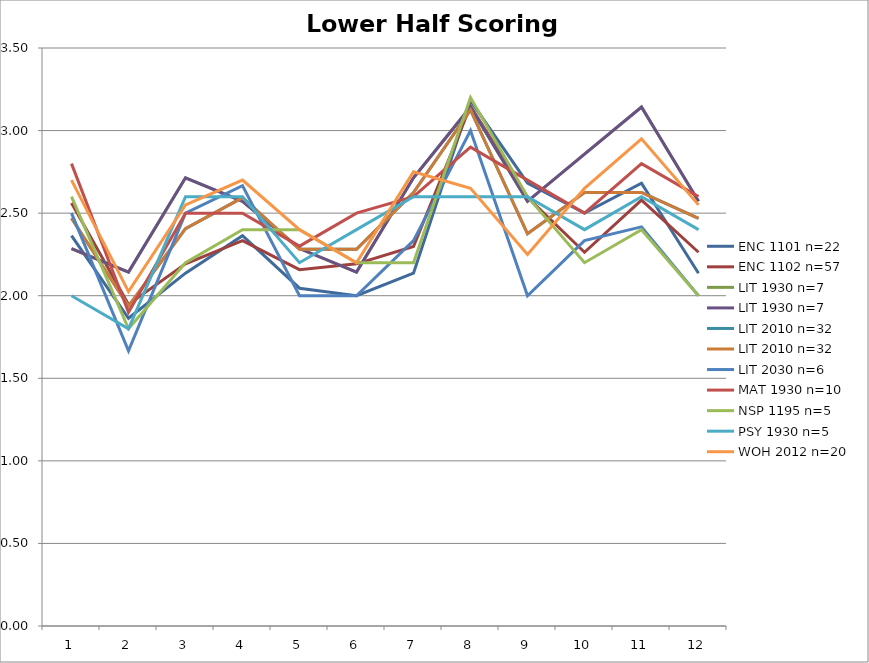
| Category | ENC 1101 n=22 | ENC 1102 n=57 | LIT 1930 n=7 | LIT 2010 n=32 | LIT 2030 n=6 | MAT 1930 n=10 | NSP 1195 n=5 | PSY 1930 n=5 | WOH 2012 n=20 |
|---|---|---|---|---|---|---|---|---|---|
| 0 | 2.364 | 2.561 | 2.286 | 2.469 | 2.5 | 2.8 | 2.6 | 2 | 2.7 |
| 1 | 1.864 | 1.947 | 2.143 | 1.938 | 1.667 | 1.9 | 1.8 | 1.8 | 2.025 |
| 2 | 2.136 | 2.193 | 2.714 | 2.406 | 2.5 | 2.5 | 2.2 | 2.6 | 2.55 |
| 3 | 2.364 | 2.333 | 2.571 | 2.594 | 2.667 | 2.5 | 2.4 | 2.6 | 2.7 |
| 4 | 2.045 | 2.158 | 2.286 | 2.281 | 2 | 2.3 | 2.4 | 2.2 | 2.4 |
| 5 | 2 | 2.193 | 2.143 | 2.281 | 2 | 2.5 | 2.2 | 2.4 | 2.2 |
| 6 | 2.136 | 2.298 | 2.714 | 2.625 | 2.333 | 2.6 | 2.2 | 2.6 | 2.75 |
| 7 | 3.182 | 3.149 | 3.143 | 3.125 | 3 | 2.9 | 3.2 | 2.6 | 2.65 |
| 8 | 2.682 | 2.596 | 2.571 | 2.375 | 2 | 2.7 | 2.6 | 2.6 | 2.25 |
| 9 | 2.5 | 2.263 | 2.857 | 2.625 | 2.333 | 2.5 | 2.2 | 2.4 | 2.65 |
| 10 | 2.682 | 2.579 | 3.143 | 2.625 | 2.417 | 2.8 | 2.4 | 2.6 | 2.95 |
| 11 | 2.136 | 2.263 | 2.571 | 2.469 | 2 | 2.6 | 2 | 2.4 | 2.55 |